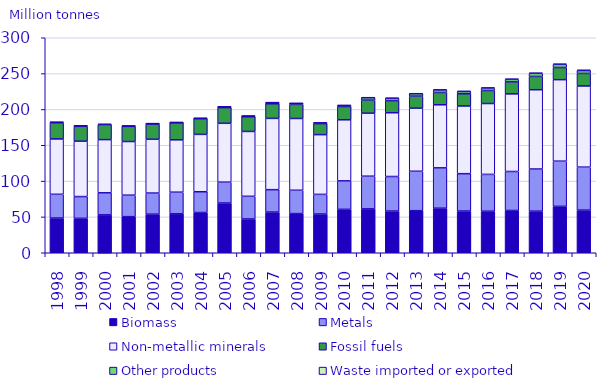
| Category | Biomass | Metals  | Non-metallic minerals | Fossil fuels | Other products | Waste imported or exported |
|---|---|---|---|---|---|---|
| 1998.0 | 48.45 | 33.124 | 77.234 | 22.307 | 1.083 | 0 |
| 1999.0 | 48.012 | 30.373 | 77.263 | 20.74 | 0.784 | 0 |
| 2000.0 | 52.89 | 30.749 | 74.22 | 21.066 | 0.882 | 0 |
| 2001.0 | 50.374 | 29.982 | 74.843 | 21.147 | 0.553 | 0 |
| 2002.0 | 53.847 | 29.421 | 75.081 | 21.298 | 0.531 | 0.002 |
| 2003.0 | 54.338 | 30.173 | 73.097 | 23.796 | 0.472 | 0.002 |
| 2004.0 | 56.123 | 28.995 | 80.051 | 21.838 | 0.702 | 0.002 |
| 2005.0 | 69.39 | 29.115 | 82.129 | 21.876 | 1.108 | 0.017 |
| 2006.0 | 47.128 | 31.629 | 90.495 | 20.558 | 1.006 | 0.008 |
| 2007.0 | 56.754 | 31.276 | 99.466 | 20.378 | 1.629 | 0.013 |
| 2008.0 | 54.647 | 32.553 | 100.126 | 19.675 | 1.537 | 0.027 |
| 2009.0 | 54.056 | 27.403 | 83.328 | 15.4 | 1.024 | 0.156 |
| 2010.0 | 60.555 | 39.747 | 85.219 | 18.484 | 1.573 | 0.29 |
| 2011.0 | 61.242 | 45.578 | 87.908 | 18.247 | 3.384 | 0.46 |
| 2012.0 | 58.132 | 48.252 | 88.97 | 16.92 | 3.263 | 0.534 |
| 2013.0 | 58.707 | 55.01 | 88.057 | 16.775 | 3.334 | 0.56 |
| 2014.0 | 62.179 | 56.273 | 88.018 | 17.193 | 3.507 | 0.667 |
| 2015.0 | 58.158 | 52.17 | 94.499 | 16.98 | 3.187 | 0.671 |
| 2016.0 | 57.97 | 51.378 | 98.878 | 18.173 | 3.379 | 0.712 |
| 2017.0 | 58.993 | 54.402 | 108.309 | 16.718 | 3.511 | 0.756 |
| 2018.0 | 58.033 | 58.791 | 110.646 | 18.555 | 4.279 | 0.736 |
| 2019.0 | 64.699 | 63.088 | 113.727 | 16.971 | 4.357 | 0.773 |
| 2020.0 | 59.479 | 59.98 | 113.275 | 17.506 | 3.956 | 0.991 |